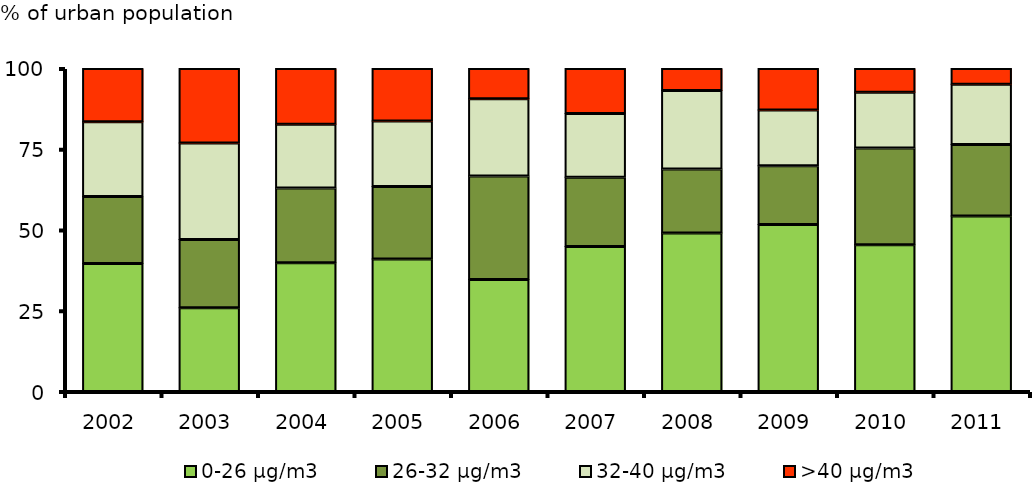
| Category | 0-26 μg/m3 | 26-32 μg/m3 | 32-40 μg/m3 | >40 μg/m3 |
|---|---|---|---|---|
| 2002.0 | 39.636 | 20.773 | 23.114 | 16.477 |
| 2003.0 | 25.932 | 21.15 | 29.858 | 23.06 |
| 2004.0 | 39.883 | 23.083 | 19.799 | 17.235 |
| 2005.0 | 40.989 | 22.501 | 20.265 | 16.244 |
| 2006.0 | 34.637 | 32.1 | 23.868 | 9.395 |
| 2007.0 | 44.86 | 21.433 | 19.761 | 13.946 |
| 2008.0 | 49.081 | 19.77 | 24.353 | 6.796 |
| 2009.0 | 51.713 | 18.205 | 17.222 | 12.86 |
| 2010.0 | 45.4 | 29.967 | 17.248 | 7.385 |
| 2011.0 | 54.329 | 22.142 | 18.621 | 4.907 |